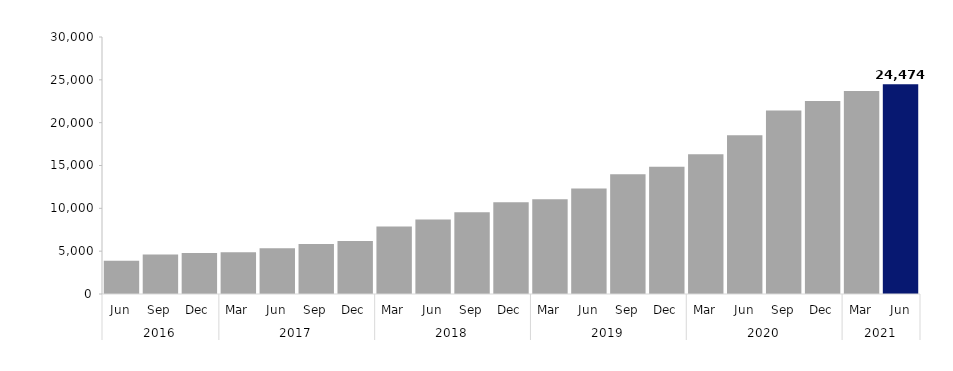
| Category | Series 0 |
|---|---|
| 0 | 3876 |
| 1 | 4602 |
| 2 | 4773 |
| 3 | 4866 |
| 4 | 5352 |
| 5 | 5844 |
| 6 | 6180 |
| 7 | 7890 |
| 8 | 8703 |
| 9 | 9537 |
| 10 | 10713 |
| 11 | 11067 |
| 12 | 12309 |
| 13 | 13965 |
| 14 | 14868 |
| 15 | 16308 |
| 16 | 18522 |
| 17 | 21414 |
| 18 | 22521 |
| 19 | 23688 |
| 20 | 24474 |